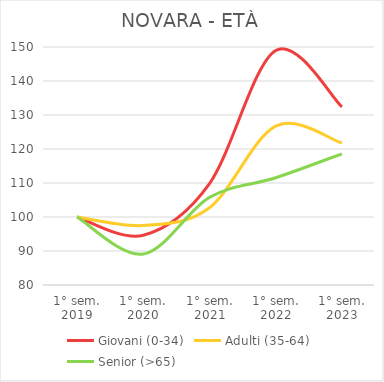
| Category | Giovani (0-34) | Adulti (35-64) | Senior (>65) |
|---|---|---|---|
| 1° sem.
2019 | 100 | 100 | 100 |
| 1° sem.
2020 | 94.648 | 97.493 | 89.103 |
| 1° sem.
2021 | 109.812 | 102.735 | 105.769 |
| 1° sem.
2022 | 148.987 | 126.757 | 111.538 |
| 1° sem.
2023 | 132.401 | 121.762 | 118.59 |